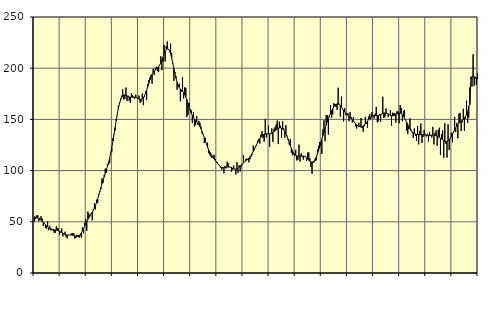
| Category | Piggar | Series 1 |
|---|---|---|
| nan | 50.1 | 54.94 |
| 87.0 | 52.7 | 54.34 |
| 87.0 | 56.3 | 54.13 |
| 87.0 | 56.3 | 53.68 |
| 87.0 | 50.7 | 53.15 |
| 87.0 | 53.3 | 52.47 |
| 87.0 | 55.6 | 51.62 |
| 87.0 | 53 | 50.64 |
| 87.0 | 45.8 | 49.56 |
| 87.0 | 49.1 | 48.41 |
| 87.0 | 44.2 | 47.2 |
| 87.0 | 43.2 | 46.02 |
| nan | 50.3 | 44.98 |
| 88.0 | 41.7 | 44.13 |
| 88.0 | 46.1 | 43.45 |
| 88.0 | 41.6 | 42.94 |
| 88.0 | 43.2 | 42.59 |
| 88.0 | 41.6 | 42.34 |
| 88.0 | 39.3 | 42.13 |
| 88.0 | 39.2 | 41.94 |
| 88.0 | 45.6 | 41.75 |
| 88.0 | 44 | 41.52 |
| 88.0 | 43.3 | 41.2 |
| 88.0 | 37.4 | 40.76 |
| nan | 39.6 | 40.19 |
| 89.0 | 43.5 | 39.49 |
| 89.0 | 35.7 | 38.79 |
| 89.0 | 38.2 | 38.15 |
| 89.0 | 40.3 | 37.65 |
| 89.0 | 35.3 | 37.31 |
| 89.0 | 33.8 | 37.13 |
| 89.0 | 37.2 | 37.1 |
| 89.0 | 37.1 | 37.13 |
| 89.0 | 38 | 37.12 |
| 89.0 | 38.7 | 37.04 |
| 89.0 | 38.9 | 36.86 |
| nan | 38.9 | 36.57 |
| 90.0 | 33.7 | 36.25 |
| 90.0 | 34.2 | 35.96 |
| 90.0 | 37.3 | 35.82 |
| 90.0 | 37.1 | 35.94 |
| 90.0 | 34.5 | 36.47 |
| 90.0 | 36.5 | 37.52 |
| 90.0 | 34.6 | 39.08 |
| 90.0 | 44.5 | 41.03 |
| 90.0 | 38.7 | 43.25 |
| 90.0 | 48.9 | 45.59 |
| 90.0 | 52.9 | 47.93 |
| nan | 41.2 | 50.17 |
| 91.0 | 60 | 52.26 |
| 91.0 | 57.9 | 54.18 |
| 91.0 | 55.5 | 55.94 |
| 91.0 | 58 | 57.63 |
| 91.0 | 51.5 | 59.37 |
| 91.0 | 62.3 | 61.28 |
| 91.0 | 68.1 | 63.49 |
| 91.0 | 62.1 | 66.07 |
| 91.0 | 71.6 | 69.02 |
| 91.0 | 68.2 | 72.35 |
| 91.0 | 76.9 | 75.94 |
| nan | 79.2 | 79.7 |
| 92.0 | 82 | 83.49 |
| 92.0 | 92.4 | 87.12 |
| 92.0 | 88.2 | 90.61 |
| 92.0 | 95.9 | 93.96 |
| 92.0 | 102 | 97.25 |
| 92.0 | 98 | 100.59 |
| 92.0 | 106.6 | 104.06 |
| 92.0 | 105.9 | 107.86 |
| 92.0 | 107.2 | 112.16 |
| 92.0 | 116.9 | 117.03 |
| 92.0 | 117.9 | 122.56 |
| nan | 131.9 | 128.7 |
| 93.0 | 134.7 | 135.26 |
| 93.0 | 139.1 | 142.01 |
| 93.0 | 150.2 | 148.66 |
| 93.0 | 154.7 | 154.93 |
| 93.0 | 163.2 | 160.54 |
| 93.0 | 166.5 | 165.25 |
| 93.0 | 170.4 | 168.91 |
| 93.0 | 173.2 | 171.49 |
| 93.0 | 179.5 | 173.07 |
| 93.0 | 169.4 | 173.79 |
| 93.0 | 170.1 | 173.86 |
| nan | 181 | 173.5 |
| 94.0 | 167.9 | 172.92 |
| 94.0 | 173.1 | 172.35 |
| 94.0 | 168.2 | 171.93 |
| 94.0 | 166.3 | 171.67 |
| 94.0 | 175.3 | 171.6 |
| 94.0 | 173.5 | 171.63 |
| 94.0 | 172.2 | 171.65 |
| 94.0 | 170.2 | 171.61 |
| 94.0 | 174.1 | 171.42 |
| 94.0 | 171.3 | 171.03 |
| 94.0 | 170.8 | 170.52 |
| nan | 173.3 | 169.97 |
| 95.0 | 166.3 | 169.55 |
| 95.0 | 167.5 | 169.48 |
| 95.0 | 175.3 | 169.97 |
| 95.0 | 163.9 | 171.14 |
| 95.0 | 172.1 | 173 |
| 95.0 | 177.6 | 175.47 |
| 95.0 | 168.8 | 178.48 |
| 95.0 | 184.7 | 181.82 |
| 95.0 | 188.4 | 185.22 |
| 95.0 | 191 | 188.46 |
| 95.0 | 193.5 | 191.39 |
| nan | 184.8 | 193.8 |
| 96.0 | 199.4 | 195.71 |
| 96.0 | 193.3 | 197.17 |
| 96.0 | 200.4 | 198.24 |
| 96.0 | 201.5 | 199.16 |
| 96.0 | 197.3 | 200.18 |
| 96.0 | 196.2 | 201.46 |
| 96.0 | 203.3 | 203.13 |
| 96.0 | 211.7 | 205.28 |
| 96.0 | 198.1 | 207.9 |
| 96.0 | 206.6 | 210.81 |
| 96.0 | 222.8 | 213.71 |
| nan | 206.5 | 216.3 |
| 97.0 | 221.7 | 218.2 |
| 97.0 | 226.1 | 219.07 |
| 97.0 | 217.8 | 218.74 |
| 97.0 | 217.5 | 217.09 |
| 97.0 | 224 | 214.12 |
| 97.0 | 215 | 210.05 |
| 97.0 | 204.6 | 205.19 |
| 97.0 | 187.6 | 199.9 |
| 97.0 | 196.3 | 194.69 |
| 97.0 | 192.1 | 190.07 |
| 97.0 | 178.9 | 186.25 |
| nan | 182.8 | 183.33 |
| 98.0 | 184.9 | 181.25 |
| 98.0 | 167.6 | 179.79 |
| 98.0 | 176.9 | 178.64 |
| 98.0 | 191.3 | 177.53 |
| 98.0 | 170.4 | 176.17 |
| 98.0 | 181.5 | 174.32 |
| 98.0 | 180.6 | 171.95 |
| 98.0 | 152.3 | 169.11 |
| 98.0 | 154.3 | 165.91 |
| 98.0 | 166 | 162.51 |
| 98.0 | 159.8 | 159.18 |
| nan | 158.9 | 156.18 |
| 99.0 | 146.7 | 153.68 |
| 99.0 | 157.3 | 151.71 |
| 99.0 | 143.2 | 150.2 |
| 99.0 | 144.4 | 148.93 |
| 99.0 | 153.4 | 147.69 |
| 99.0 | 144.9 | 146.38 |
| 99.0 | 148.6 | 144.83 |
| 99.0 | 146.8 | 142.97 |
| 99.0 | 143 | 140.78 |
| 99.0 | 135.9 | 138.22 |
| 99.0 | 134.9 | 135.28 |
| nan | 126.9 | 132.09 |
| 0.0 | 132 | 128.84 |
| 0.0 | 126 | 125.71 |
| 0.0 | 127.3 | 122.8 |
| 0.0 | 117 | 120.25 |
| 0.0 | 115.6 | 118.05 |
| 0.0 | 113.8 | 116.12 |
| 0.0 | 112.4 | 114.45 |
| 0.0 | 113.8 | 112.91 |
| 0.0 | 115.5 | 111.46 |
| 0.0 | 111.4 | 110.02 |
| 0.0 | 108.1 | 108.59 |
| nan | 108.1 | 107.18 |
| 1.0 | 106.4 | 105.85 |
| 1.0 | 104.3 | 104.67 |
| 1.0 | 102.9 | 103.74 |
| 1.0 | 100.8 | 103.11 |
| 1.0 | 103.6 | 102.81 |
| 1.0 | 97.4 | 102.81 |
| 1.0 | 104.6 | 103.01 |
| 1.0 | 102.1 | 103.28 |
| 1.0 | 108.7 | 103.49 |
| 1.0 | 107.1 | 103.57 |
| 1.0 | 103.7 | 103.5 |
| nan | 103.5 | 103.26 |
| 2.0 | 98.9 | 102.82 |
| 2.0 | 100.9 | 102.28 |
| 2.0 | 104.9 | 101.75 |
| 2.0 | 101.8 | 101.37 |
| 2.0 | 96.2 | 101.26 |
| 2.0 | 108.1 | 101.52 |
| 2.0 | 97.9 | 102.17 |
| 2.0 | 105.2 | 103.11 |
| 2.0 | 99.2 | 104.23 |
| 2.0 | 104 | 105.38 |
| 2.0 | 105.4 | 106.49 |
| nan | 115.3 | 107.53 |
| 3.0 | 108.6 | 108.5 |
| 3.0 | 111.3 | 109.41 |
| 3.0 | 111.8 | 110.28 |
| 3.0 | 110.3 | 111.19 |
| 3.0 | 108 | 112.24 |
| 3.0 | 111.1 | 113.46 |
| 3.0 | 113.5 | 114.93 |
| 3.0 | 115.5 | 116.72 |
| 3.0 | 124.5 | 118.73 |
| 3.0 | 120 | 120.92 |
| 3.0 | 122.7 | 123.17 |
| nan | 124.4 | 125.34 |
| 4.0 | 129.2 | 127.4 |
| 4.0 | 130.8 | 129.35 |
| 4.0 | 126.4 | 131.09 |
| 4.0 | 135.1 | 132.62 |
| 4.0 | 138.5 | 133.9 |
| 4.0 | 131.8 | 134.91 |
| 4.0 | 128.2 | 135.58 |
| 4.0 | 150.5 | 135.88 |
| 4.0 | 132.4 | 135.96 |
| 4.0 | 135.7 | 135.91 |
| 4.0 | 143.9 | 135.85 |
| nan | 123.1 | 135.91 |
| 5.0 | 135.6 | 136.13 |
| 5.0 | 141.2 | 136.54 |
| 5.0 | 127.9 | 137.17 |
| 5.0 | 140.8 | 137.98 |
| 5.0 | 142.4 | 138.86 |
| 5.0 | 145.2 | 139.77 |
| 5.0 | 148.9 | 140.63 |
| 5.0 | 125.9 | 141.29 |
| 5.0 | 147.9 | 141.64 |
| 5.0 | 143.8 | 141.7 |
| 5.0 | 132.1 | 141.41 |
| nan | 148 | 140.73 |
| 6.0 | 141.1 | 139.63 |
| 6.0 | 132.2 | 138.05 |
| 6.0 | 144.4 | 136.02 |
| 6.0 | 134.2 | 133.56 |
| 6.0 | 129.9 | 130.73 |
| 6.0 | 125.5 | 127.67 |
| 6.0 | 130.7 | 124.6 |
| 6.0 | 117.4 | 121.75 |
| 6.0 | 115 | 119.33 |
| 6.0 | 115.8 | 117.37 |
| 6.0 | 114.1 | 115.94 |
| nan | 120.3 | 114.99 |
| 7.0 | 109.9 | 114.39 |
| 7.0 | 110.5 | 114.07 |
| 7.0 | 125.3 | 113.98 |
| 7.0 | 108.8 | 114.05 |
| 7.0 | 116.8 | 114.2 |
| 7.0 | 113.4 | 114.3 |
| 7.0 | 110.7 | 114.21 |
| 7.0 | 114.3 | 113.88 |
| 7.0 | 114.1 | 113.28 |
| 7.0 | 109.5 | 112.41 |
| 7.0 | 117.6 | 111.3 |
| nan | 117.7 | 110.11 |
| 8.0 | 112.1 | 109.1 |
| 8.0 | 103.6 | 108.44 |
| 8.0 | 97 | 108.19 |
| 8.0 | 107.4 | 108.5 |
| 8.0 | 108.6 | 109.54 |
| 8.0 | 109.6 | 111.26 |
| 8.0 | 110.1 | 113.64 |
| 8.0 | 120.7 | 116.56 |
| 8.0 | 124.2 | 119.84 |
| 8.0 | 127.9 | 123.37 |
| 8.0 | 125.5 | 127.03 |
| nan | 116.4 | 130.67 |
| 9.0 | 140.2 | 134.24 |
| 9.0 | 149.2 | 137.76 |
| 9.0 | 128.7 | 141.28 |
| 9.0 | 154.2 | 144.67 |
| 9.0 | 154.2 | 147.84 |
| 9.0 | 135.2 | 150.83 |
| 9.0 | 152.2 | 153.61 |
| 9.0 | 163.9 | 156.14 |
| 9.0 | 151.3 | 158.43 |
| 9.0 | 154.8 | 160.45 |
| 9.0 | 165.9 | 162.19 |
| nan | 165 | 163.61 |
| 10.0 | 162.2 | 164.61 |
| 10.0 | 159.3 | 165.08 |
| 10.0 | 180.9 | 165.01 |
| 10.0 | 165.3 | 164.47 |
| 10.0 | 152.7 | 163.47 |
| 10.0 | 172.3 | 162.09 |
| 10.0 | 159.9 | 160.5 |
| 10.0 | 147.9 | 158.87 |
| 10.0 | 161.1 | 157.34 |
| 10.0 | 154.1 | 156.04 |
| 10.0 | 154.9 | 154.9 |
| nan | 156.3 | 153.86 |
| 11.0 | 148.2 | 152.87 |
| 11.0 | 157.3 | 151.88 |
| 11.0 | 152.3 | 150.83 |
| 11.0 | 147 | 149.66 |
| 11.0 | 152.3 | 148.42 |
| 11.0 | 146.9 | 147.13 |
| 11.0 | 143.3 | 145.87 |
| 11.0 | 141.1 | 144.76 |
| 11.0 | 144.1 | 143.85 |
| 11.0 | 146.7 | 143.17 |
| 11.0 | 143.2 | 142.77 |
| nan | 151.4 | 142.69 |
| 12.0 | 141.5 | 142.97 |
| 12.0 | 138 | 143.6 |
| 12.0 | 143.3 | 144.48 |
| 12.0 | 152.5 | 145.61 |
| 12.0 | 145.5 | 146.96 |
| 12.0 | 141.7 | 148.42 |
| 12.0 | 152.8 | 149.93 |
| 12.0 | 155.3 | 151.35 |
| 12.0 | 150.2 | 152.44 |
| 12.0 | 157.1 | 153.15 |
| 12.0 | 153.3 | 153.52 |
| nan | 150.8 | 153.65 |
| 13.0 | 155.6 | 153.63 |
| 13.0 | 162.2 | 153.63 |
| 13.0 | 147.1 | 153.72 |
| 13.0 | 148.2 | 153.91 |
| 13.0 | 155.4 | 154.26 |
| 13.0 | 147.7 | 154.77 |
| 13.0 | 155.1 | 155.33 |
| 13.0 | 172.1 | 155.79 |
| 13.0 | 151.5 | 156.13 |
| 13.0 | 152.2 | 156.26 |
| 13.0 | 160.7 | 156.14 |
| nan | 155.9 | 155.83 |
| 14.0 | 152.3 | 155.34 |
| 14.0 | 154.8 | 154.7 |
| 14.0 | 159 | 154.11 |
| 14.0 | 144 | 153.71 |
| 14.0 | 156.6 | 153.53 |
| 14.0 | 155.9 | 153.6 |
| 14.0 | 156.3 | 153.95 |
| 14.0 | 146.8 | 154.52 |
| 14.0 | 157.9 | 155.18 |
| 14.0 | 157.7 | 155.79 |
| 14.0 | 146.2 | 156.14 |
| nan | 164 | 156.07 |
| 15.0 | 161 | 155.56 |
| 15.0 | 148.2 | 154.57 |
| 15.0 | 158.3 | 153.11 |
| 15.0 | 159.1 | 151.3 |
| 15.0 | 149.6 | 149.22 |
| 15.0 | 139.1 | 146.98 |
| 15.0 | 136 | 144.74 |
| 15.0 | 140.9 | 142.58 |
| 15.0 | 150.9 | 140.67 |
| 15.0 | 140.2 | 139.08 |
| 15.0 | 137.1 | 137.83 |
| nan | 131.8 | 136.9 |
| 16.0 | 141.2 | 136.2 |
| 16.0 | 134 | 135.71 |
| 16.0 | 128.8 | 135.41 |
| 16.0 | 143.5 | 135.21 |
| 16.0 | 125.7 | 135.09 |
| 16.0 | 138.7 | 135.08 |
| 16.0 | 145.9 | 135.13 |
| 16.0 | 126.9 | 135.19 |
| 16.0 | 132.8 | 135.16 |
| 16.0 | 139.7 | 135.02 |
| 16.0 | 135.2 | 134.86 |
| nan | 133.3 | 134.71 |
| 17.0 | 136.1 | 134.54 |
| 17.0 | 128.3 | 134.45 |
| 17.0 | 137.8 | 134.47 |
| 17.0 | 134.8 | 134.53 |
| 17.0 | 132.4 | 134.63 |
| 17.0 | 142.7 | 134.68 |
| 17.0 | 125.6 | 134.59 |
| 17.0 | 136.9 | 134.44 |
| 17.0 | 139.3 | 134.18 |
| 17.0 | 124.3 | 133.76 |
| 17.0 | 139.9 | 133.19 |
| nan | 141.9 | 132.47 |
| 18.0 | 115.4 | 131.69 |
| 18.0 | 135.7 | 130.87 |
| 18.0 | 139.1 | 130.03 |
| 18.0 | 112.5 | 129.25 |
| 18.0 | 146.2 | 128.64 |
| 18.0 | 126 | 128.4 |
| 18.0 | 112.8 | 128.57 |
| 18.0 | 145.2 | 129.17 |
| 18.0 | 120 | 130.2 |
| 18.0 | 131.5 | 131.68 |
| 18.0 | 137 | 133.48 |
| nan | 127.7 | 135.51 |
| 19.0 | 138.6 | 137.7 |
| 19.0 | 152.4 | 139.87 |
| 19.0 | 137.6 | 141.85 |
| 19.0 | 146.7 | 143.63 |
| 19.0 | 131.6 | 145.14 |
| 19.0 | 155.7 | 146.29 |
| 19.0 | 156.4 | 147.33 |
| 19.0 | 138.7 | 148.23 |
| 19.0 | 147.1 | 149.1 |
| 19.0 | 160.3 | 150.15 |
| 19.0 | 139 | 151.45 |
| nan | 150.6 | 152.96 |
| 20.0 | 168.4 | 154.63 |
| 20.0 | 146.8 | 156.3 |
| 20.0 | 151.9 | 163.1 |
| 20.0 | 181.2 | 164.45 |
| 20.0 | 189.8 | 191.08 |
| 20.0 | 181.9 | 191.73 |
| 20.0 | 213.6 | 191.87 |
| 20.0 | 182.6 | 191.65 |
| 20.0 | 189.8 | 191.16 |
| 20.0 | 183.9 | 190.47 |
| 20.0 | 195.1 | 189.69 |